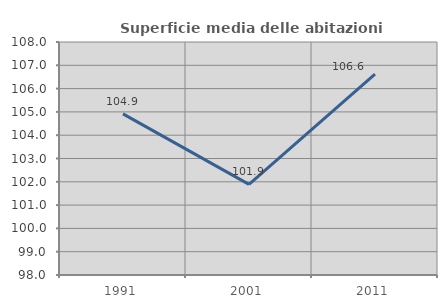
| Category | Superficie media delle abitazioni occupate |
|---|---|
| 1991.0 | 104.914 |
| 2001.0 | 101.891 |
| 2011.0 | 106.621 |